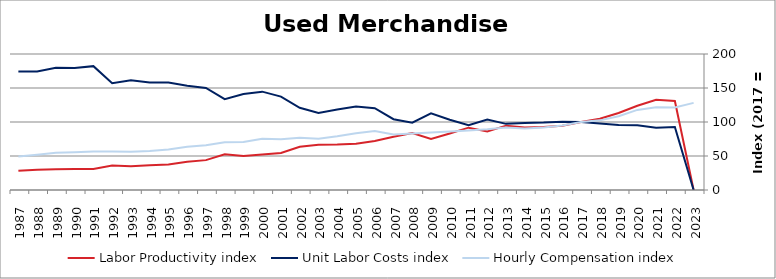
| Category | Labor Productivity index | Unit Labor Costs index | Hourly Compensation index |
|---|---|---|---|
| 2023.0 | 0 | 0 | 128.116 |
| 2022.0 | 130.848 | 92.631 | 121.207 |
| 2021.0 | 132.796 | 91.502 | 121.511 |
| 2020.0 | 123.8 | 95.132 | 117.774 |
| 2019.0 | 113.279 | 95.72 | 108.43 |
| 2018.0 | 104.839 | 97.684 | 102.411 |
| 2017.0 | 100 | 100 | 100 |
| 2016.0 | 94.588 | 100.33 | 94.9 |
| 2015.0 | 92.605 | 99.09 | 91.763 |
| 2014.0 | 91.999 | 98.466 | 90.587 |
| 2013.0 | 94.606 | 97.255 | 92.009 |
| 2012.0 | 86.178 | 103.668 | 89.34 |
| 2011.0 | 91.671 | 95.257 | 87.323 |
| 2010.0 | 83.139 | 103.339 | 85.915 |
| 2009.0 | 74.973 | 112.851 | 84.608 |
| 2008.0 | 83.925 | 99.089 | 83.16 |
| 2007.0 | 78.372 | 104.109 | 81.592 |
| 2006.0 | 72.18 | 120.253 | 86.799 |
| 2005.0 | 67.98 | 122.825 | 83.497 |
| 2004.0 | 66.872 | 118.262 | 79.084 |
| 2003.0 | 66.526 | 113.404 | 75.443 |
| 2002.0 | 63.475 | 120.91 | 76.748 |
| 2001.0 | 54.341 | 137.313 | 74.617 |
| 2000.0 | 52.104 | 144.641 | 75.364 |
| 1999.0 | 50.027 | 141.178 | 70.627 |
| 1998.0 | 52.421 | 133.628 | 70.049 |
| 1997.0 | 43.938 | 150.097 | 65.95 |
| 1996.0 | 41.58 | 153.217 | 63.708 |
| 1995.0 | 37.655 | 157.917 | 59.463 |
| 1994.0 | 36.291 | 158.214 | 57.417 |
| 1993.0 | 34.836 | 161.465 | 56.247 |
| 1992.0 | 36.012 | 157.144 | 56.59 |
| 1991.0 | 30.997 | 182.151 | 56.461 |
| 1990.0 | 30.969 | 179.297 | 55.526 |
| 1989.0 | 30.531 | 179.612 | 54.838 |
| 1988.0 | 29.777 | 174.254 | 51.887 |
| 1987.0 | 28.191 | 174.308 | 49.139 |